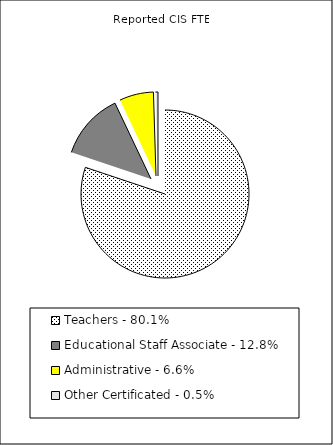
| Category | Reported FTE |
|---|---|
| Teachers - 80.1% | 63929.62 |
| Educational Staff Associate - 12.8% | 10211.54 |
| Administrative - 6.6% | 5240.21 |
| Other Certificated - 0.5% | 389.77 |